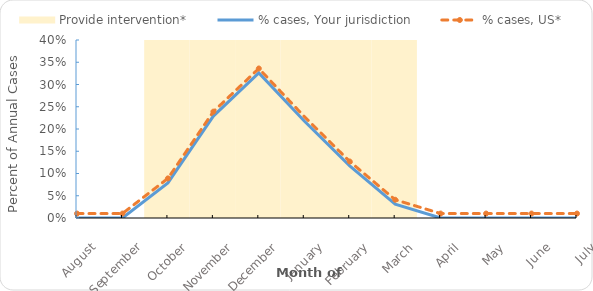
| Category | Provide intervention* |
|---|---|
| 0 | 0 |
| 1 | 0 |
| 2 | 1 |
| 3 | 1 |
| 4 | 1 |
| 5 | 1 |
| 6 | 1 |
| 7 | 1 |
| 8 | 0 |
| 9 | 0 |
| 10 | 0 |
| 11 | 0 |